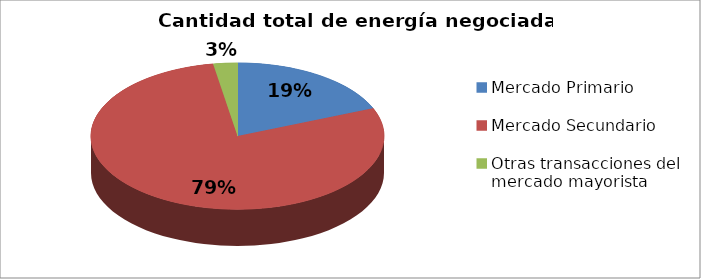
| Category | N° Contratos |
|---|---|
| Mercado Primario | 1743783 |
| Mercado Secundario | 7296328 |
| Otras transacciones del mercado mayorista | 247380 |